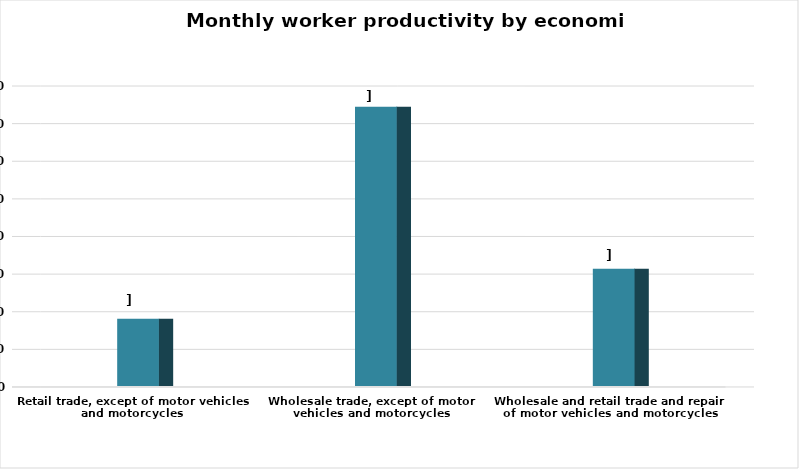
| Category | إنتاجية المشتغل  |
|---|---|
| Wholesale and retail trade and repair of motor vehicles and motorcycles | 31181.133 |
| Wholesale trade, except of motor vehicles and motorcycles | 74248.281 |
| Retail trade, except of motor vehicles and motorcycles | 17860.404 |